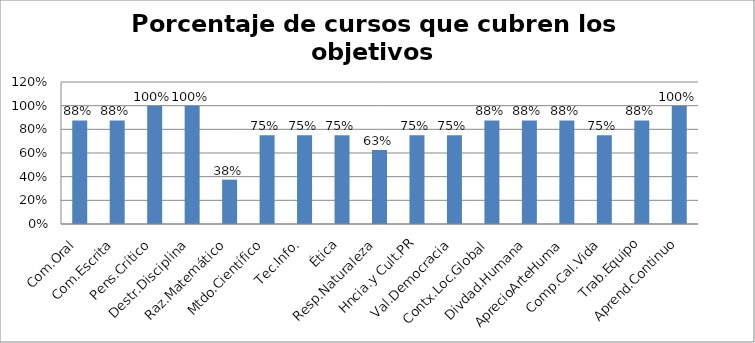
| Category | Series 0 |
|---|---|
| Com.Oral | 0.875 |
| Com.Escrita | 0.875 |
| Pens.Crítico | 1 |
| Destr.Disciplina | 1 |
| Raz.Matemático | 0.375 |
| Mtdo.Científico | 0.75 |
| Tec.Info. | 0.75 |
| Ética | 0.75 |
| Resp.Naturaleza | 0.625 |
| Hncia.y Cult.PR | 0.75 |
| Val.Democracia | 0.75 |
| Contx.Loc.Global | 0.875 |
| Divdad.Humana | 0.875 |
| AprecioArteHuma | 0.875 |
| Comp.Cal.Vida | 0.75 |
| Trab.Equipo | 0.875 |
| Aprend.Continuo | 1 |